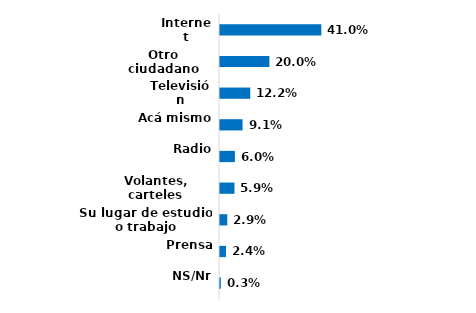
| Category | Series 0 |
|---|---|
| Internet | 0.41 |
| Otro ciudadano | 0.2 |
| Televisión | 0.122 |
| Acá mismo  | 0.091 |
| Radio | 0.06 |
| Volantes, carteles | 0.059 |
| Su lugar de estudio o trabajo | 0.029 |
| Prensa | 0.024 |
| NS/Nr | 0.003 |